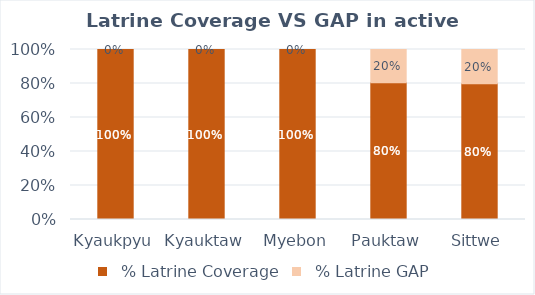
| Category |   % Latrine Coverage |   % Latrine GAP |
|---|---|---|
| Kyaukpyu | 1 | 0 |
| Kyauktaw | 1 | 0 |
| Myebon | 1 | 0 |
| Pauktaw | 0.804 | 0.196 |
| Sittwe | 0.799 | 0.201 |